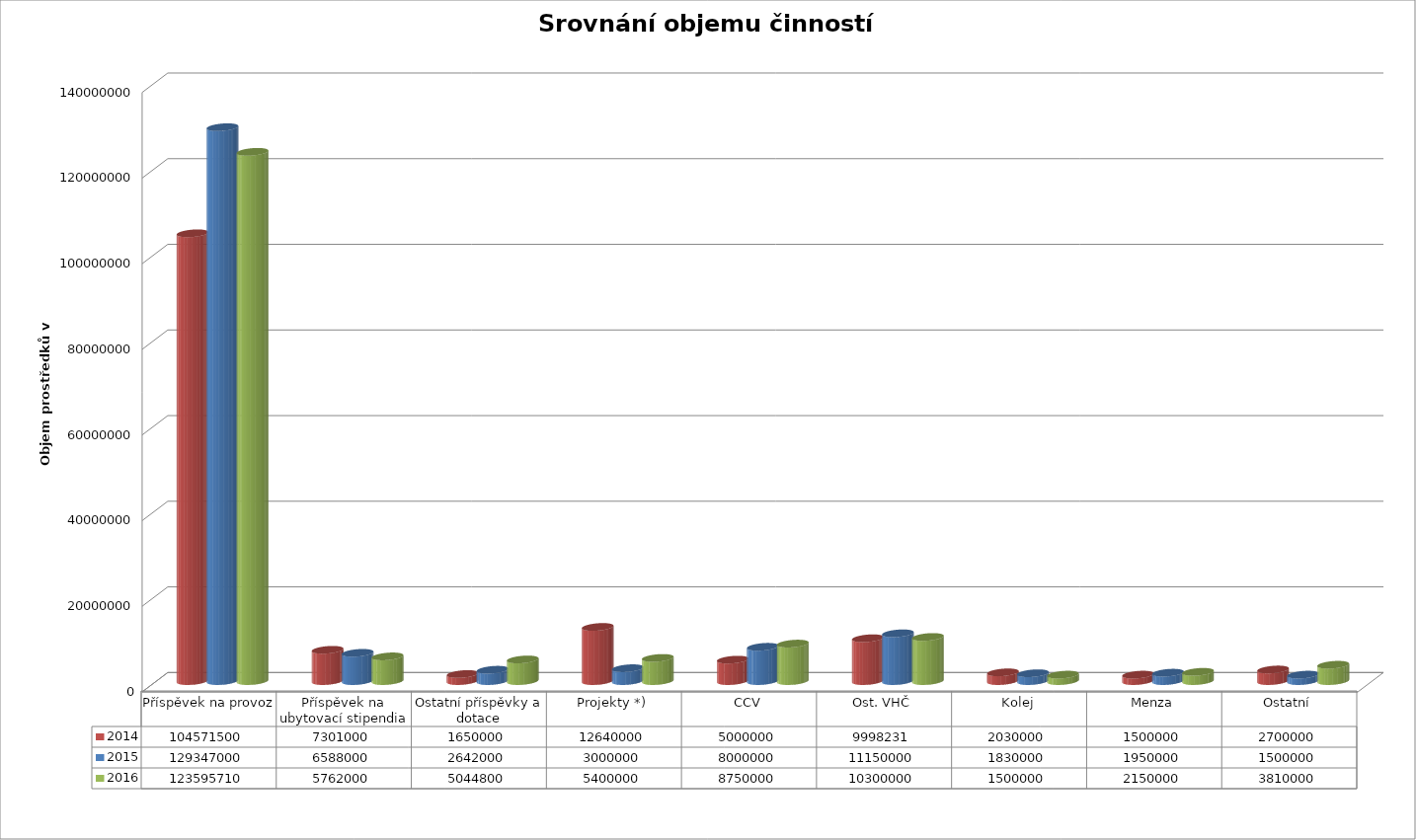
| Category | 2014 | 2015 | 2016 |
|---|---|---|---|
| Příspěvek na provoz | 104571500 | 129347000 | 123595710 |
| Příspěvek na ubytovací stipendia | 7301000 | 6588000 | 5762000 |
| Ostatní příspěvky a dotace | 1650000 | 2642000 | 5044800 |
| Projekty *) | 12640000 | 3000000 | 5400000 |
| CCV | 5000000 | 8000000 | 8750000 |
| Ost. VHČ | 9998231 | 11150000 | 10300000 |
| Kolej | 2030000 | 1830000 | 1500000 |
| Menza | 1500000 | 1950000 | 2150000 |
| Ostatní | 2700000 | 1500000 | 3810000 |